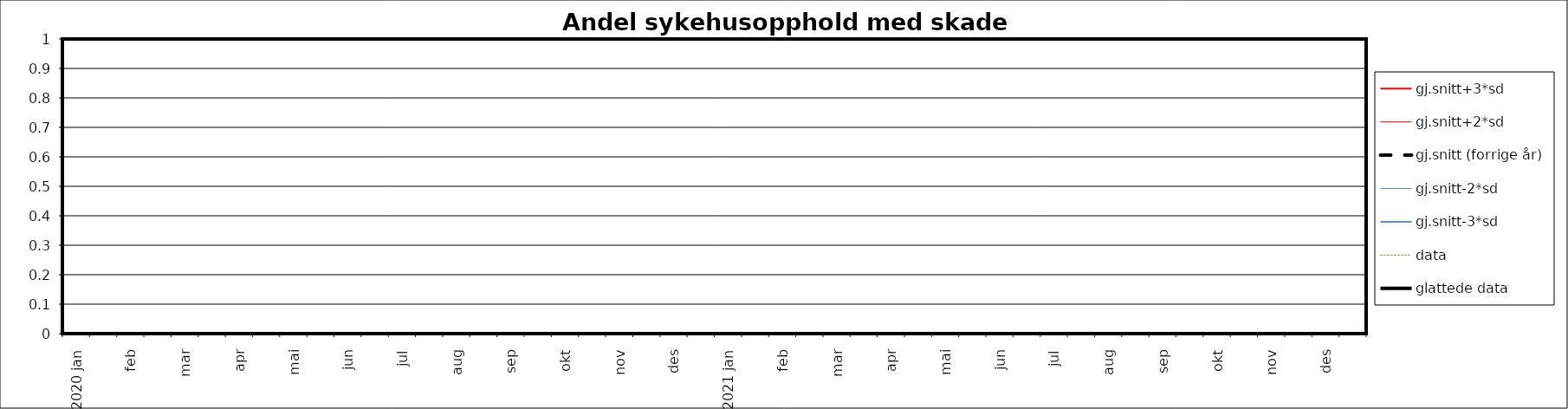
| Category | gj.snitt+3*sd | gj.snitt+2*sd | gj.snitt (forrige år) | gj.snitt-2*sd | gj.snitt-3*sd | data | glattede data |
|---|---|---|---|---|---|---|---|
| 2020 jan | 0 | 0 | 0 | 0 | 0 | 0 | 0 |
|  | 0 | 0 | 0 | 0 | 0 | 0 | 0 |
| feb | 0 | 0 | 0 | 0 | 0 | 0 | 0 |
|  | 0 | 0 | 0 | 0 | 0 | 0 | 0 |
| mar | 0 | 0 | 0 | 0 | 0 | 0 | 0 |
|  | 0 | 0 | 0 | 0 | 0 | 0 | 0 |
| apr | 0 | 0 | 0 | 0 | 0 | 0 | 0 |
|  | 0 | 0 | 0 | 0 | 0 | 0 | 0 |
| mai | 0 | 0 | 0 | 0 | 0 | 0 | 0 |
|  | 0 | 0 | 0 | 0 | 0 | 0 | 0 |
| jun | 0 | 0 | 0 | 0 | 0 | 0 | 0 |
|  | 0 | 0 | 0 | 0 | 0 | 0 | 0 |
| jul | 0 | 0 | 0 | 0 | 0 | 0 | 0 |
|  | 0 | 0 | 0 | 0 | 0 | 0 | 0 |
| aug | 0 | 0 | 0 | 0 | 0 | 0 | 0 |
|  | 0 | 0 | 0 | 0 | 0 | 0 | 0 |
| sep | 0 | 0 | 0 | 0 | 0 | 0 | 0 |
|  | 0 | 0 | 0 | 0 | 0 | 0 | 0 |
| okt | 0 | 0 | 0 | 0 | 0 | 0 | 0 |
|  | 0 | 0 | 0 | 0 | 0 | 0 | 0 |
| nov | 0 | 0 | 0 | 0 | 0 | 0 | 0 |
|  | 0 | 0 | 0 | 0 | 0 | 0 | 0 |
| des | 0 | 0 | 0 | 0 | 0 | 0 | 0 |
|  | 0 | 0 | 0 | 0 | 0 | 0 | 0 |
| 2021 jan | 0 | 0 | 0 | 0 | 0 | 0 | 0 |
|  | 0 | 0 | 0 | 0 | 0 | 0 | 0 |
| feb | 0 | 0 | 0 | 0 | 0 | 0 | 0 |
|  | 0 | 0 | 0 | 0 | 0 | 0 | 0 |
| mar | 0 | 0 | 0 | 0 | 0 | 0 | 0 |
|  | 0 | 0 | 0 | 0 | 0 | 0 | 0 |
| apr | 0 | 0 | 0 | 0 | 0 | 0 | 0 |
|  | 0 | 0 | 0 | 0 | 0 | 0 | 0 |
| mai | 0 | 0 | 0 | 0 | 0 | 0 | 0 |
|  | 0 | 0 | 0 | 0 | 0 | 0 | 0 |
| jun | 0 | 0 | 0 | 0 | 0 | 0 | 0 |
|  | 0 | 0 | 0 | 0 | 0 | 0 | 0 |
| jul | 0 | 0 | 0 | 0 | 0 | 0 | 0 |
|  | 0 | 0 | 0 | 0 | 0 | 0 | 0 |
| aug | 0 | 0 | 0 | 0 | 0 | 0 | 0 |
|  | 0 | 0 | 0 | 0 | 0 | 0 | 0 |
| sep | 0 | 0 | 0 | 0 | 0 | 0 | 0 |
|  | 0 | 0 | 0 | 0 | 0 | 0 | 0 |
| okt | 0 | 0 | 0 | 0 | 0 | 0 | 0 |
|  | 0 | 0 | 0 | 0 | 0 | 0 | 0 |
| nov | 0 | 0 | 0 | 0 | 0 | 0 | 0 |
|  | 0 | 0 | 0 | 0 | 0 | 0 | 0 |
| des | 0 | 0 | 0 | 0 | 0 | 0 | 0 |